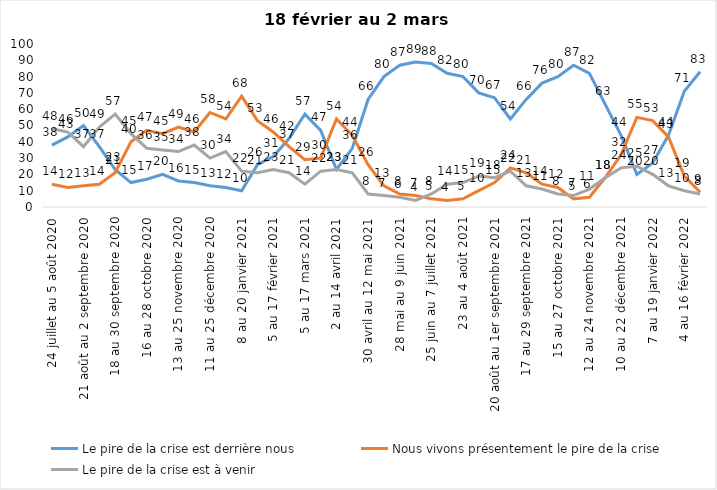
| Category | Le pire de la crise est derrière nous | Nous vivons présentement le pire de la crise | Le pire de la crise est à venir |
|---|---|---|---|
| 24 juillet au 5 août 2020 | 38 | 14 | 48 |
| 7 au 19 août 2020 | 43 | 12 | 46 |
| 21 août au 2 septembre 2020 | 50 | 13 | 37 |
| 4 au 16 septembre 2020 | 37 | 14 | 49 |
| 18 au 30 septembre 2020 | 23 | 21 | 57 |
| 2 au 14 octobre 2020 | 15 | 40 | 45 |
| 16 au 28 octobre 2020 | 17 | 47 | 36 |
| 30 octobre au 11 novembre 2020 | 20 | 45 | 35 |
| 13 au 25 novembre 2020 | 16 | 49 | 34 |
| 27 au 9 décembre 2020 | 15 | 46 | 38 |
| 11 au 25 décembre 2020 | 13 | 58 | 30 |
| 25 décembre 2020 au 6 janvier 2021 | 12 | 54 | 34 |
| 8 au 20 janvier 2021 | 10 | 68 | 22 |
| 22 janvier au 3 février 2021 | 26 | 53 | 21 |
| 5 au 17 février 2021 | 31 | 46 | 23 |
| 19 février au 3 mars 2021 | 42 | 37 | 21 |
| 5 au 17 mars 2021 | 57 | 29 | 14 |
| 19 au 31 mars 2021 | 47 | 30 | 22 |
| 2 au 14 avril 2021 | 23 | 54 | 23 |
| 16 au 28 avril 2021 | 36 | 44 | 21 |
| 30 avril au 12 mai 2021 | 66 | 26 | 8 |
| 14 au 26 mai 2021 | 80 | 13 | 7 |
| 28 mai au 9 juin 2021 | 87 | 8 | 6 |
| 11 au 23 juin 2021 | 89 | 7 | 4 |
| 25 juin au 7 juillet 2021 | 88 | 5 | 8 |
| 9 au 21 juillet 2021 | 82 | 4 | 14 |
| 23 au 4 août 2021 | 80 | 5 | 15 |
| 6 au 18 août 2021 | 70 | 10 | 19 |
| 20 août au 1er septembre 2021 | 67 | 15 | 18 |
| 3 au 15 septembre 2021 | 54 | 24 | 22 |
| 17 au 29 septembre 2021 | 66 | 21 | 13 |
| 1 au 13 octobre 2021 | 76 | 14 | 11 |
| 15 au 27 octobre 2021 | 80 | 12 | 8 |
| 29 octobre au 10 novembre 2021 | 87 | 5 | 7 |
| 12 au 24 novembre 2021 | 82 | 6 | 11 |
| 26 novembre au 8 décembre 2021 | 63 | 18 | 18 |
| 10 au 22 décembre 2021 | 44 | 32 | 24 |
| 24 décembre 2021 au 5 janvier 2022 2022 | 20 | 55 | 25 |
| 7 au 19 janvier 2022 | 27 | 53 | 20 |
| 21 janvier au 2 février 2022 | 44 | 43 | 13 |
| 4 au 16 février 2022 | 71 | 19 | 10 |
| 18 février au 2 mars  2022 | 83 | 9 | 8 |